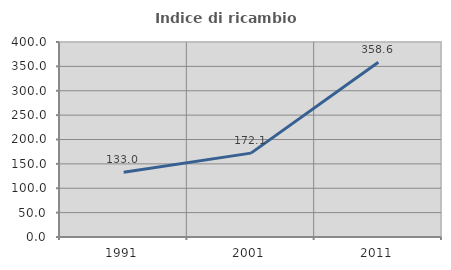
| Category | Indice di ricambio occupazionale  |
|---|---|
| 1991.0 | 132.964 |
| 2001.0 | 172.085 |
| 2011.0 | 358.59 |